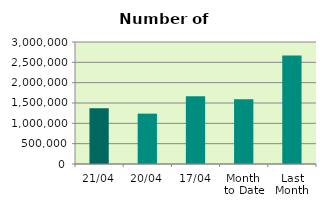
| Category | Series 0 |
|---|---|
| 21/04 | 1368252 |
| 20/04 | 1238748 |
| 17/04 | 1664020 |
| Month 
to Date | 1594074.615 |
| Last
Month | 2666736.455 |